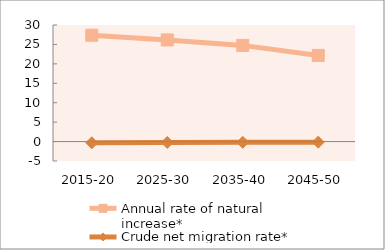
| Category | Annual rate of natural increase* | Crude net migration rate* |
|---|---|---|
| 2015-20 | 27.368 | -0.305 |
| 2025-30 | 26.157 | -0.234 |
| 2035-40 | 24.753 | -0.182 |
| 2045-50 | 22.175 | -0.144 |